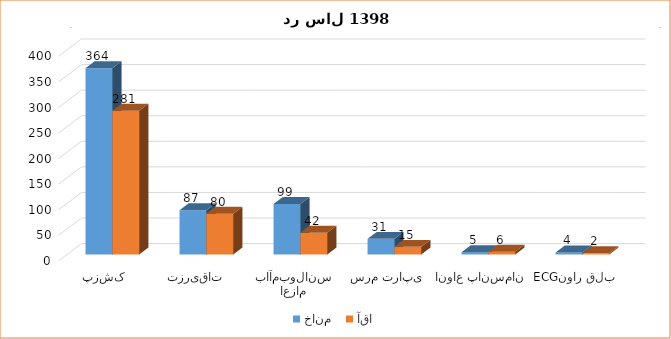
| Category | خانم  | آقا |
|---|---|---|
| پزشک | 364.25 | 281.167 |
| تزریقات  | 86.667 | 79.833 |
| اعزام باآمبولانس | 98.75 | 42.333 |
| سرم تراپی | 30.5 | 14.917 |
| انواع پانسمان | 4.5 | 5.5 |
| ECGنوار قلب | 4 | 2.25 |